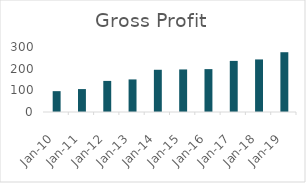
| Category | Gross Profit |
|---|---|
| 2010-03-31 | 96.23 |
| 2011-03-31 | 105.79 |
| 2012-03-31 | 143.48 |
| 2013-03-31 | 150.36 |
| 2014-03-31 | 194.89 |
| 2015-03-31 | 196.4 |
| 2016-03-31 | 197.93 |
| 2017-03-31 | 235.86 |
| 2018-03-31 | 242.62 |
| 2019-03-31 | 275.91 |